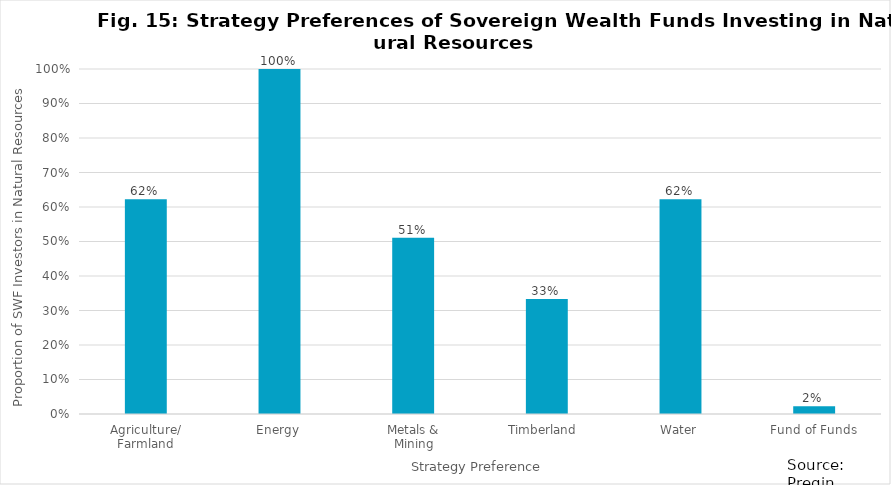
| Category | Series 0 |
|---|---|
| Agriculture/
Farmland | 0.622 |
| Energy | 1 |
| Metals &
Mining | 0.511 |
| Timberland  | 0.333 |
| Water | 0.622 |
| Fund of Funds | 0.022 |